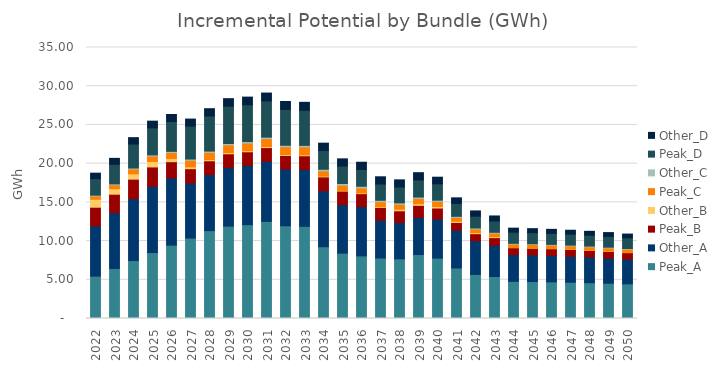
| Category | Peak_A | Other_A | Peak_B | Other_B | Peak_C | Other_C | Peak_D | Other_D |
|---|---|---|---|---|---|---|---|---|
| 2022.0 | 5.472 | 6.483 | 2.417 | 1.028 | 0.415 | 0.111 | 2.138 | 0.706 |
| 2023.0 | 6.465 | 7.211 | 2.375 | 0.717 | 0.493 | 0.125 | 2.53 | 0.768 |
| 2024.0 | 7.486 | 7.997 | 2.513 | 0.69 | 0.614 | 0.135 | 3.1 | 0.823 |
| 2025.0 | 8.517 | 8.554 | 2.503 | 0.705 | 0.704 | 0.145 | 3.492 | 0.867 |
| 2026.0 | 9.473 | 8.692 | 2.088 | 0.404 | 0.777 | 0.155 | 3.853 | 0.909 |
| 2027.0 | 10.387 | 7.112 | 1.851 | 0.229 | 0.852 | 0.163 | 4.254 | 0.908 |
| 2028.0 | 11.353 | 7.216 | 1.802 | 0.156 | 0.925 | 0.172 | 4.531 | 0.943 |
| 2029.0 | 11.927 | 7.557 | 1.789 | 0.151 | 0.993 | 0.181 | 4.816 | 0.978 |
| 2030.0 | 12.114 | 7.665 | 1.754 | 0.135 | 0.992 | 0.191 | 4.749 | 0.992 |
| 2031.0 | 12.54 | 7.758 | 1.776 | 0.139 | 1.005 | 0.203 | 4.684 | 1.01 |
| 2032.0 | 11.979 | 7.331 | 1.74 | 0.114 | 1.018 | 0.189 | 4.636 | 1.023 |
| 2033.0 | 11.902 | 7.351 | 1.764 | 0.114 | 1.034 | 0.194 | 4.53 | 1.03 |
| 2034.0 | 9.267 | 7.217 | 1.806 | 0.096 | 0.689 | 0.198 | 2.437 | 0.935 |
| 2035.0 | 8.437 | 6.267 | 1.752 | 0.09 | 0.669 | 0.22 | 2.259 | 0.924 |
| 2036.0 | 8.082 | 6.354 | 1.688 | 0.088 | 0.658 | 0.21 | 2.17 | 0.932 |
| 2037.0 | 7.813 | 4.873 | 1.65 | 0.086 | 0.647 | 0.201 | 2.092 | 0.94 |
| 2038.0 | 7.706 | 4.683 | 1.517 | 0.205 | 0.639 | 0.185 | 2.049 | 0.92 |
| 2039.0 | 8.26 | 4.789 | 1.566 | 0.204 | 0.688 | 0.176 | 2.22 | 0.927 |
| 2040.0 | 7.797 | 5.045 | 1.426 | 0.196 | 0.66 | 0.159 | 2.11 | 0.856 |
| 2041.0 | 6.529 | 4.874 | 0.994 | 0.15 | 0.506 | 0.143 | 1.663 | 0.725 |
| 2042.0 | 5.692 | 4.352 | 0.91 | 0.139 | 0.47 | 0.129 | 1.519 | 0.684 |
| 2043.0 | 5.427 | 4.037 | 0.98 | 0.128 | 0.445 | 0.116 | 1.453 | 0.658 |
| 2044.0 | 4.798 | 3.456 | 0.886 | 0.032 | 0.437 | 0.101 | 1.438 | 0.52 |
| 2045.0 | 4.771 | 3.432 | 0.883 | 0.032 | 0.435 | 0.1 | 1.432 | 0.517 |
| 2046.0 | 4.733 | 3.4 | 0.879 | 0.032 | 0.433 | 0.099 | 1.425 | 0.513 |
| 2047.0 | 4.685 | 3.359 | 0.873 | 0.032 | 0.429 | 0.097 | 1.415 | 0.509 |
| 2048.0 | 4.626 | 3.309 | 0.865 | 0.032 | 0.425 | 0.096 | 1.404 | 0.503 |
| 2049.0 | 4.556 | 3.251 | 0.855 | 0.031 | 0.421 | 0.094 | 1.39 | 0.496 |
| 2050.0 | 4.477 | 3.185 | 0.842 | 0.031 | 0.416 | 0.092 | 1.375 | 0.489 |